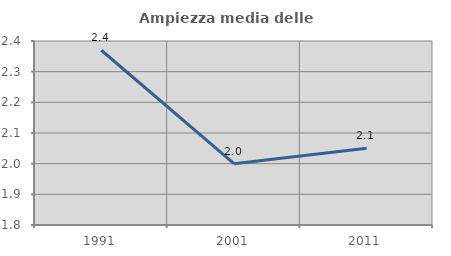
| Category | Ampiezza media delle famiglie |
|---|---|
| 1991.0 | 2.37 |
| 2001.0 | 2 |
| 2011.0 | 2.05 |